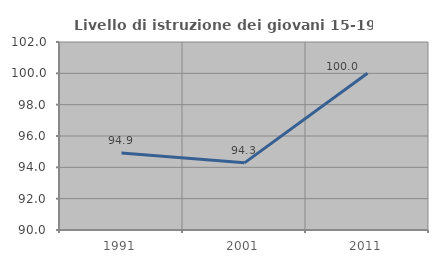
| Category | Livello di istruzione dei giovani 15-19 anni |
|---|---|
| 1991.0 | 94.915 |
| 2001.0 | 94.286 |
| 2011.0 | 100 |